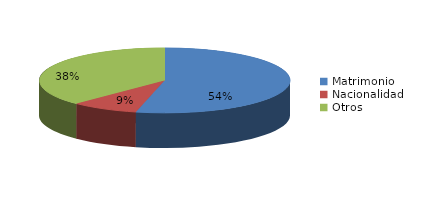
| Category | Series 0 |
|---|---|
| Matrimonio | 858 |
| Nacionalidad | 139 |
| Otros | 602 |